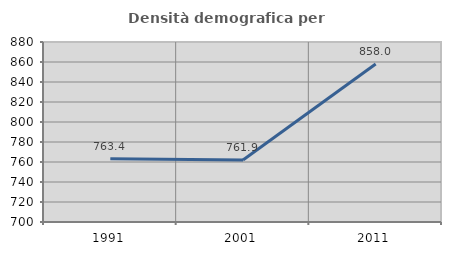
| Category | Densità demografica |
|---|---|
| 1991.0 | 763.358 |
| 2001.0 | 761.935 |
| 2011.0 | 858.003 |